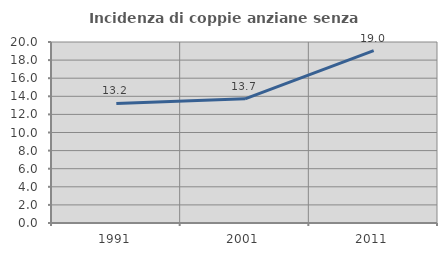
| Category | Incidenza di coppie anziane senza figli  |
|---|---|
| 1991.0 | 13.208 |
| 2001.0 | 13.725 |
| 2011.0 | 19.048 |